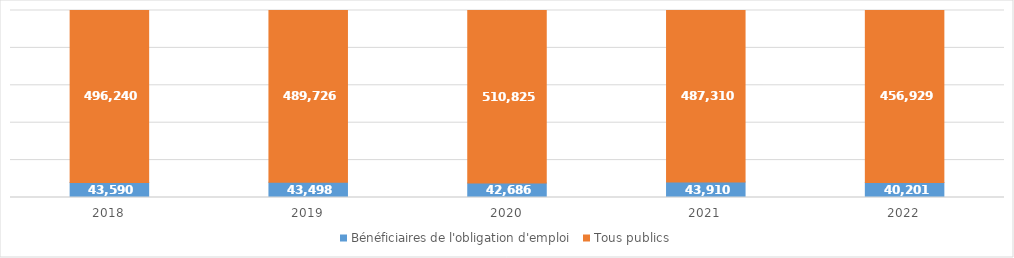
| Category | Bénéficiaires de l'obligation d'emploi | Tous publics |
|---|---|---|
| 2018 | 43590 | 496240 |
| 2019 | 43498 | 489726 |
| 2020 | 42686 | 510825 |
| 2021 | 43910 | 487310 |
| 2022 | 40201 | 456929 |